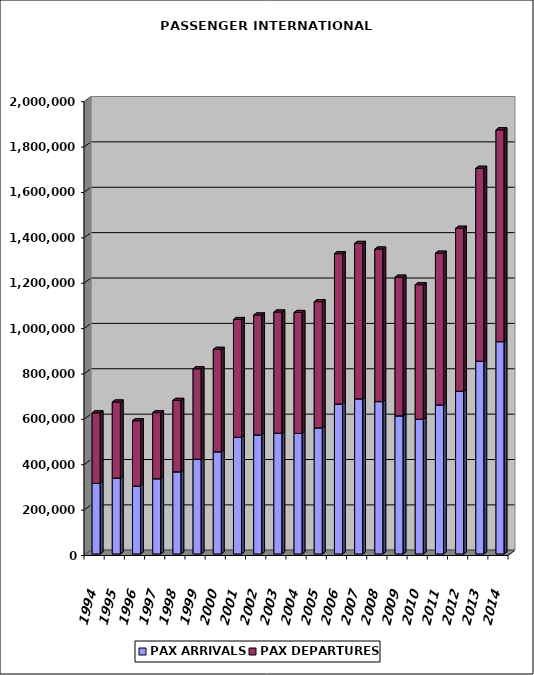
| Category | PAX ARRIVALS | PAX DEPARTURES |
|---|---|---|
| 1994.0 | 311007 | 310979 |
| 1995.0 | 334118 | 335398 |
| 1996.0 | 299346 | 287760 |
| 1997.0 | 331475 | 291214 |
| 1998.0 | 362033 | 314654 |
| 1999.0 | 417136 | 398909 |
| 2000.0 | 450258 | 451452 |
| 2001.0 | 514495 | 518623 |
| 2002.0 | 524740 | 528318 |
| 2003.0 | 532208 | 533904 |
| 2004.0 | 531277 | 532876 |
| 2005.0 | 555647 | 555981 |
| 2006.0 | 660904 | 662652 |
| 2007.0 | 683669 | 684847 |
| 2008.0 | 671477 | 672446 |
| 2009.0 | 608693 | 611086 |
| 2010.0 | 593228 | 593357 |
| 2011.0 | 656791 | 668706 |
| 2012.0 | 717249 | 718064 |
| 2013.0 | 849271 | 850306 |
| 2014.0 | 935615 | 933665 |